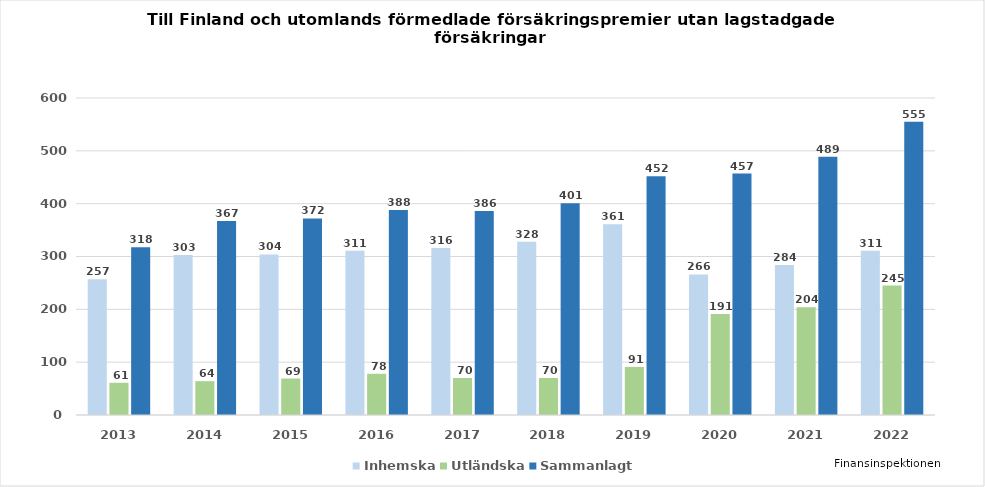
| Category | Inhemska | Utländska | Sammanlagt |
|---|---|---|---|
| 2013.0 | 257 | 61 | 317.523 |
| 2014.0 | 303 | 64 | 367 |
| 2015.0 | 304 | 69 | 372 |
| 2016.0 | 311 | 78 | 388 |
| 2017.0 | 316 | 70 | 386 |
| 2018.0 | 328 | 70 | 401 |
| 2019.0 | 361 | 91 | 452 |
| 2020.0 | 266 | 191 | 457 |
| 2021.0 | 284 | 204 | 489 |
| 2022.0 | 311 | 245 | 555 |